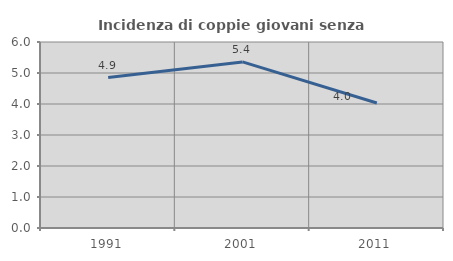
| Category | Incidenza di coppie giovani senza figli |
|---|---|
| 1991.0 | 4.854 |
| 2001.0 | 5.357 |
| 2011.0 | 4.032 |